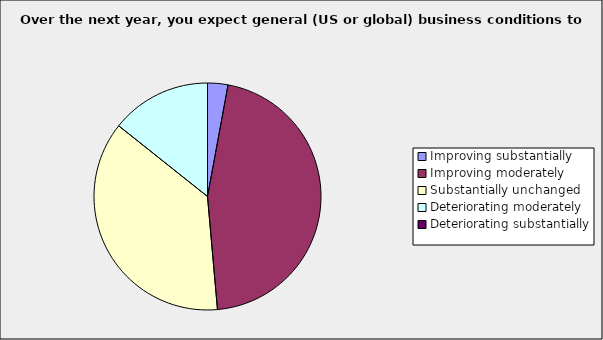
| Category | Series 0 |
|---|---|
| Improving substantially | 0.029 |
| Improving moderately | 0.457 |
| Substantially unchanged | 0.371 |
| Deteriorating moderately | 0.143 |
| Deteriorating substantially | 0 |